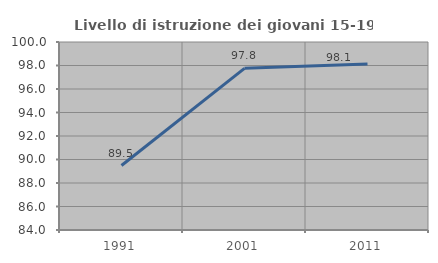
| Category | Livello di istruzione dei giovani 15-19 anni |
|---|---|
| 1991.0 | 89.487 |
| 2001.0 | 97.756 |
| 2011.0 | 98.118 |